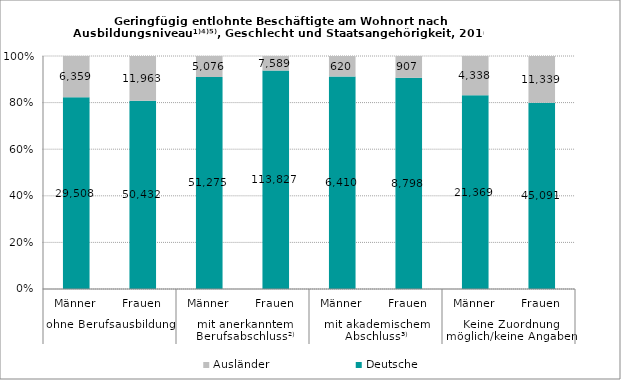
| Category | Deutsche | Ausländer |
|---|---|---|
| 0 | 29508 | 6359 |
| 1 | 50432 | 11963 |
| 2 | 51275 | 5076 |
| 3 | 113827 | 7589 |
| 4 | 6410 | 620 |
| 5 | 8798 | 907 |
| 6 | 21369 | 4338 |
| 7 | 45091 | 11339 |